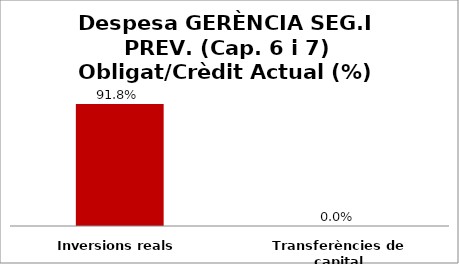
| Category | Series 0 |
|---|---|
| Inversions reals | 0.918 |
| Transferències de capital | 0 |